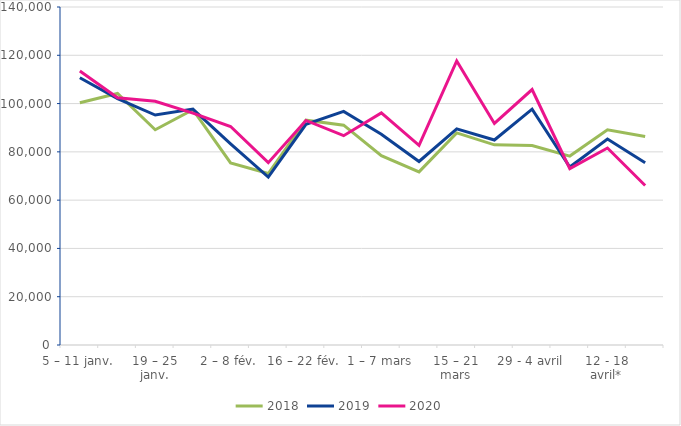
| Category | 2018 | 2019 | 2020 |
|---|---|---|---|
| 5 – 11 janv. | 100330 | 110701 | 113506 |
| 12 – 18 janv. | 104190 | 102045 | 102407 |
| 19 – 25 janv. | 89142 | 95260 | 100966 |
| 26 janv. – 1 fév. | 97441 | 97699 | 96042 |
| 2 – 8 fév. | 75434 | 83347 | 90495 |
| 9 – 15 fév. | 71031 | 69559 | 75523 |
| 16 – 22 fév. | 93102 | 91428 | 93003 |
| 23 – 29 fév. | 91065 | 96774 | 86699 |
| 1 – 7 mars | 78415 | 87314 | 96119 |
| 8 – 14 mars | 71697 | 76021 | 82690 |
| 15 – 21 mars | 87845 | 89536 | 117673 |
| 22 - 28 mars | 82895 | 84912 | 91764 |
| 29 - 4 avril | 82654 | 97699 | 105802 |
| 5 - 11 avril* | 78244 | 73699 | 73061 |
| 12 - 18 avril* | 89129 | 85348 | 81593 |
| 19 - 25 avril* | 86398 | 75509 | 66045 |